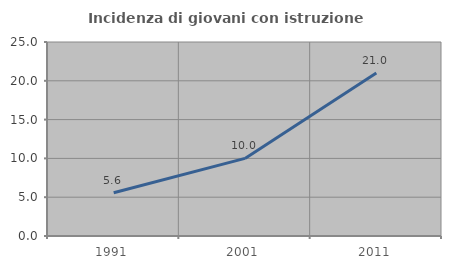
| Category | Incidenza di giovani con istruzione universitaria |
|---|---|
| 1991.0 | 5.57 |
| 2001.0 | 10 |
| 2011.0 | 20.994 |